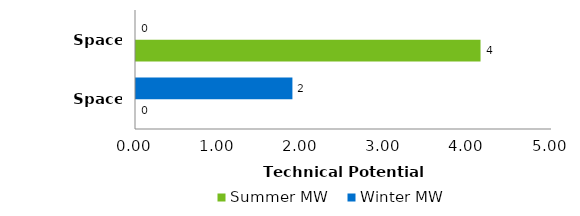
| Category | Summer MW | Winter MW |
|---|---|---|
| Space Heating | 0 | 1.88 |
| Space Cooling | 4.141 | 0 |